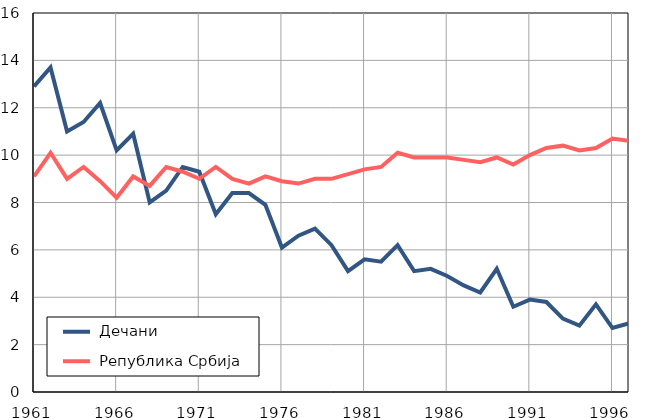
| Category |  Дечани |  Република Србија |
|---|---|---|
| 1961.0 | 12.9 | 9.1 |
| 1962.0 | 13.7 | 10.1 |
| 1963.0 | 11 | 9 |
| 1964.0 | 11.4 | 9.5 |
| 1965.0 | 12.2 | 8.9 |
| 1966.0 | 10.2 | 8.2 |
| 1967.0 | 10.9 | 9.1 |
| 1968.0 | 8 | 8.7 |
| 1969.0 | 8.5 | 9.5 |
| 1970.0 | 9.5 | 9.3 |
| 1971.0 | 9.3 | 9 |
| 1972.0 | 7.5 | 9.5 |
| 1973.0 | 8.4 | 9 |
| 1974.0 | 8.4 | 8.8 |
| 1975.0 | 7.9 | 9.1 |
| 1976.0 | 6.1 | 8.9 |
| 1977.0 | 6.6 | 8.8 |
| 1978.0 | 6.9 | 9 |
| 1979.0 | 6.2 | 9 |
| 1980.0 | 5.1 | 9.2 |
| 1981.0 | 5.6 | 9.4 |
| 1982.0 | 5.5 | 9.5 |
| 1983.0 | 6.2 | 10.1 |
| 1984.0 | 5.1 | 9.9 |
| 1985.0 | 5.2 | 9.9 |
| 1986.0 | 4.9 | 9.9 |
| 1987.0 | 4.5 | 9.8 |
| 1988.0 | 4.2 | 9.7 |
| 1989.0 | 5.2 | 9.9 |
| 1990.0 | 3.6 | 9.6 |
| 1991.0 | 3.9 | 10 |
| 1992.0 | 3.8 | 10.3 |
| 1993.0 | 3.1 | 10.4 |
| 1994.0 | 2.8 | 10.2 |
| 1995.0 | 3.7 | 10.3 |
| 1996.0 | 2.7 | 10.7 |
| 1997.0 | 2.9 | 10.6 |